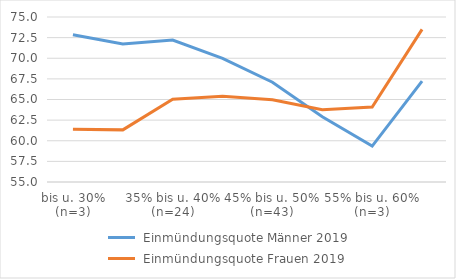
| Category |  Einmündungsquote Männer 2019 |  Einmündungsquote Frauen 2019 |
|---|---|---|
| bis u. 30% (n=3) | 72.842 | 61.403 |
| 30% bis u. 35% (n=8) | 71.735 | 61.318 |
| 35% bis u. 40% (n=24) | 72.206 | 65.04 |
| 40% bis u. 45% (n=52) | 69.992 | 65.392 |
| 45% bis u. 50% (n=43) | 67.099 | 64.978 |
| 50% bis u. 55% (n=19) | 62.912 | 63.766 |
| 55% bis u. 60% (n=3) | 59.355 | 64.088 |
| 60% und mehr (n=2) | 67.236 | 73.504 |